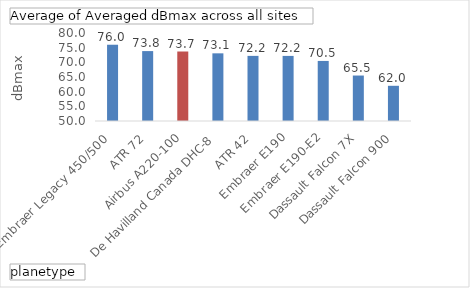
| Category | Total |
|---|---|
| Embraer Legacy 450/500  | 76 |
| ATR 72 | 73.833 |
| Airbus A220-100 | 73.692 |
| De Havilland Canada DHC-8 | 73.068 |
| ATR 42 | 72.2 |
| Embraer E190 | 72.19 |
| Embraer E190-E2 | 70.476 |
| Dassault Falcon 7X | 65.5 |
| Dassault Falcon 900 | 62 |